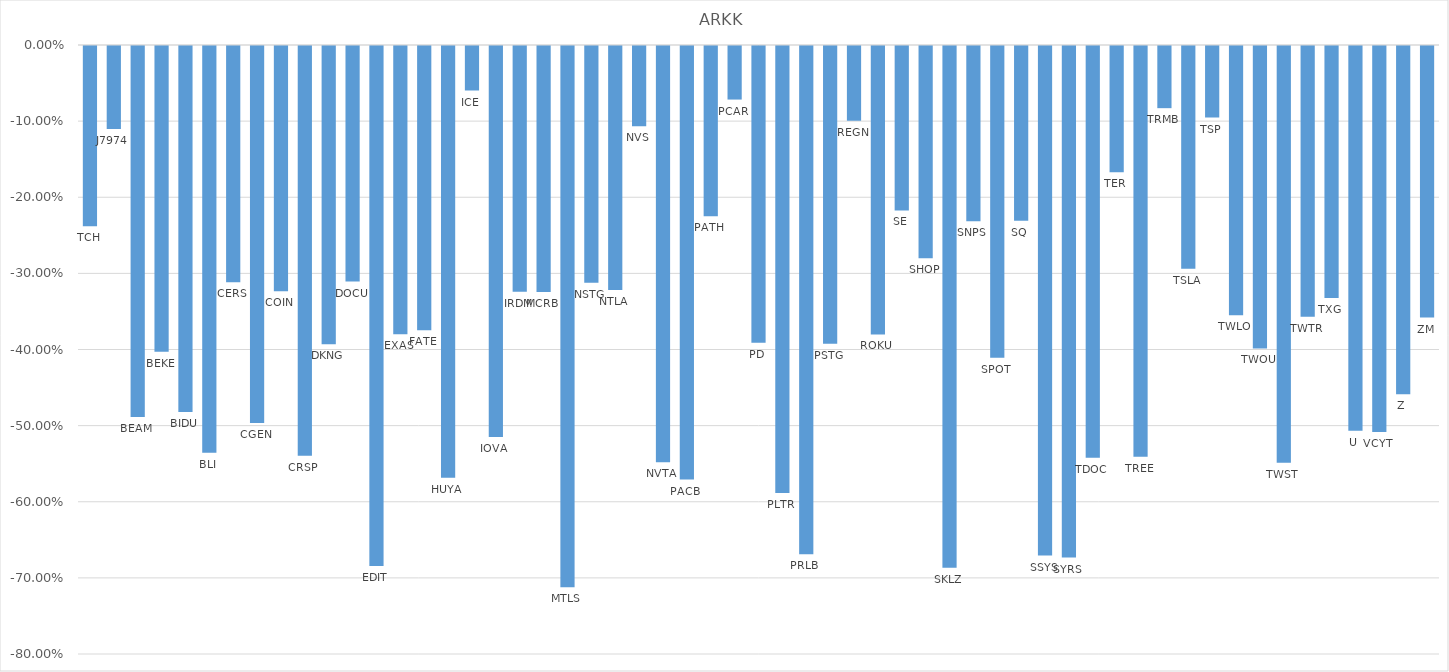
| Category | Series 0 |
|---|---|
| TCH | -0.237 |
| J7974 | -0.109 |
| BEAM | -0.487 |
| BEKE | -0.402 |
| BIDU | -0.481 |
| BLI | -0.534 |
| CERS | -0.31 |
| CGEN | -0.495 |
| COIN | -0.322 |
| CRSP | -0.538 |
| DKNG | -0.392 |
| DOCU | -0.31 |
| EDIT | -0.683 |
| EXAS | -0.379 |
| FATE | -0.373 |
| HUYA | -0.567 |
| ICE | -0.058 |
| IOVA | -0.514 |
| IRDM | -0.323 |
| MCRB | -0.323 |
| MTLS | -0.711 |
| NSTG | -0.311 |
| NTLA | -0.321 |
| NVS | -0.105 |
| NVTA | -0.547 |
| PACB | -0.57 |
| PATH | -0.224 |
| PCAR | -0.07 |
| PD | -0.39 |
| PLTR | -0.587 |
| PRLB | -0.668 |
| PSTG | -0.391 |
| REGN | -0.098 |
| ROKU | -0.379 |
| SE | -0.216 |
| SHOP | -0.279 |
| SKLZ | -0.685 |
| SNPS | -0.23 |
| SPOT | -0.41 |
| SQ | -0.229 |
| SSYS | -0.669 |
| SYRS | -0.672 |
| TDOC | -0.541 |
| TER | -0.166 |
| TREE | -0.54 |
| TRMB | -0.082 |
| TSLA | -0.293 |
| TSP | -0.094 |
| TWLO | -0.354 |
| TWOU | -0.397 |
| TWST | -0.547 |
| TWTR | -0.356 |
| TXG | -0.331 |
| U | -0.505 |
| VCYT | -0.507 |
| Z | -0.457 |
| ZM | -0.357 |